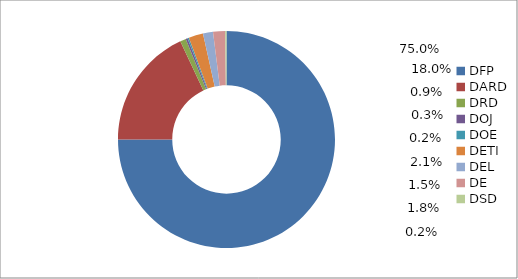
| Category | Series 0 |
|---|---|
| DFP | 0.75 |
| DARD | 0.18 |
| DRD | 0.009 |
| DOJ | 0.003 |
| DOE | 0.002 |
| DETI | 0.021 |
| DEL | 0.015 |
| DE | 0.018 |
| DSD | 0.002 |